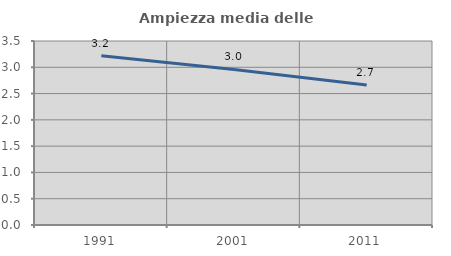
| Category | Ampiezza media delle famiglie |
|---|---|
| 1991.0 | 3.219 |
| 2001.0 | 2.959 |
| 2011.0 | 2.665 |